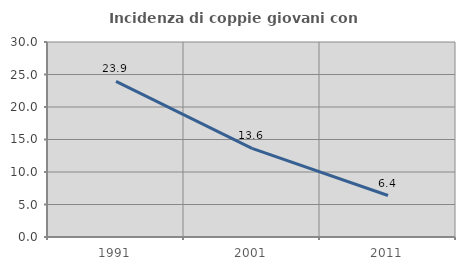
| Category | Incidenza di coppie giovani con figli |
|---|---|
| 1991.0 | 23.932 |
| 2001.0 | 13.636 |
| 2011.0 | 6.383 |